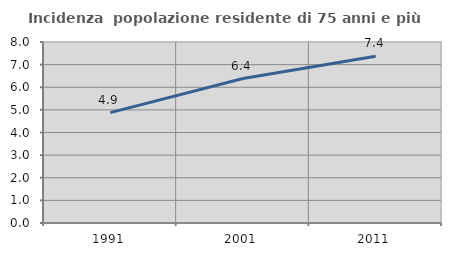
| Category | Incidenza  popolazione residente di 75 anni e più |
|---|---|
| 1991.0 | 4.876 |
| 2001.0 | 6.384 |
| 2011.0 | 7.375 |